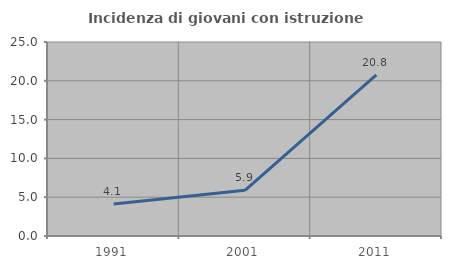
| Category | Incidenza di giovani con istruzione universitaria |
|---|---|
| 1991.0 | 4.11 |
| 2001.0 | 5.882 |
| 2011.0 | 20.755 |